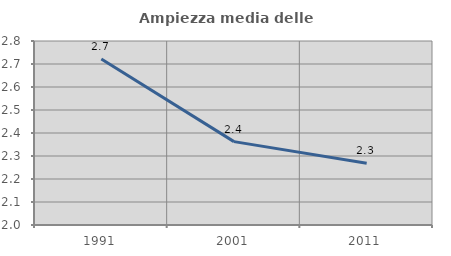
| Category | Ampiezza media delle famiglie |
|---|---|
| 1991.0 | 2.721 |
| 2001.0 | 2.363 |
| 2011.0 | 2.268 |